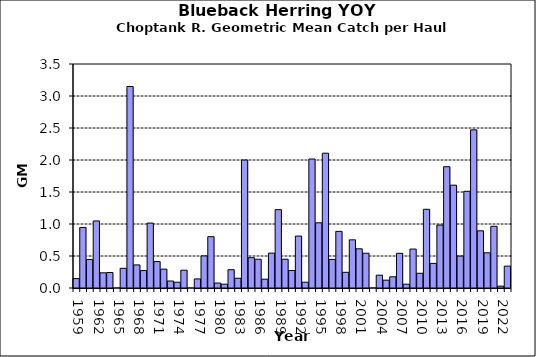
| Category | Series 0 |
|---|---|
| 1959.0 | 0.147 |
| 1960.0 | 0.946 |
| 1961.0 | 0.445 |
| 1962.0 | 1.047 |
| 1963.0 | 0.237 |
| 1964.0 | 0.242 |
| 1965.0 | 0 |
| 1966.0 | 0.308 |
| 1967.0 | 3.148 |
| 1968.0 | 0.361 |
| 1969.0 | 0.273 |
| 1970.0 | 1.014 |
| 1971.0 | 0.413 |
| 1972.0 | 0.295 |
| 1973.0 | 0.109 |
| 1974.0 | 0.091 |
| 1975.0 | 0.278 |
| 1976.0 | 0 |
| 1977.0 | 0.142 |
| 1978.0 | 0.501 |
| 1979.0 | 0.802 |
| 1980.0 | 0.078 |
| 1981.0 | 0.059 |
| 1982.0 | 0.286 |
| 1983.0 | 0.152 |
| 1984.0 | 1.999 |
| 1985.0 | 0.474 |
| 1986.0 | 0.449 |
| 1987.0 | 0.137 |
| 1988.0 | 0.545 |
| 1989.0 | 1.224 |
| 1990.0 | 0.45 |
| 1991.0 | 0.273 |
| 1992.0 | 0.811 |
| 1993.0 | 0.091 |
| 1994.0 | 2.015 |
| 1995.0 | 1.019 |
| 1996.0 | 2.106 |
| 1997.0 | 0.447 |
| 1998.0 | 0.885 |
| 1999.0 | 0.245 |
| 2000.0 | 0.753 |
| 2001.0 | 0.612 |
| 2002.0 | 0.543 |
| 2003.0 | 0 |
| 2004.0 | 0.2 |
| 2005.0 | 0.122 |
| 2006.0 | 0.175 |
| 2007.0 | 0.542 |
| 2008.0 | 0.059 |
| 2009.0 | 0.608 |
| 2010.0 | 0.23 |
| 2011.0 | 1.23 |
| 2012.0 | 0.385 |
| 2013.0 | 0.984 |
| 2014.0 | 1.895 |
| 2015.0 | 1.607 |
| 2016.0 | 0.499 |
| 2017.0 | 1.511 |
| 2018.0 | 2.471 |
| 2019.0 | 0.894 |
| 2020.0 | 0.55 |
| 2021.0 | 0.964 |
| 2022.0 | 0.029 |
| 2023.0 | 0.341 |